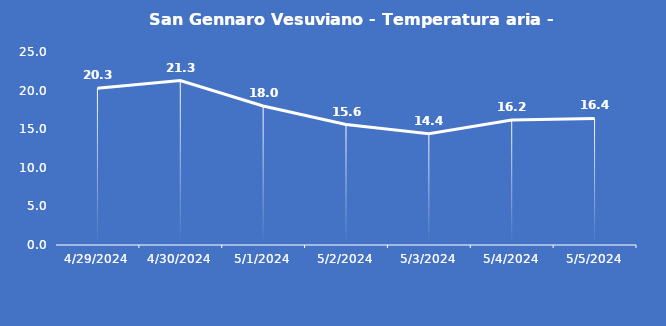
| Category | San Gennaro Vesuviano - Temperatura aria - Grezzo (°C) |
|---|---|
| 4/29/24 | 20.3 |
| 4/30/24 | 21.3 |
| 5/1/24 | 18 |
| 5/2/24 | 15.6 |
| 5/3/24 | 14.4 |
| 5/4/24 | 16.2 |
| 5/5/24 | 16.4 |